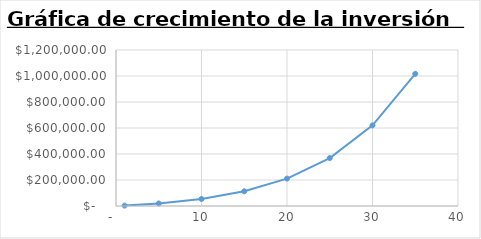
| Category | Monto Acum. |
|---|---|
| 1.0 | 3000 |
| 5.0 | 19489.297 |
| 10.0 | 54179.041 |
| 15.0 | 113212.689 |
| 20.0 | 210749.865 |
| 25.0 | 368606.35 |
| 30.0 | 620255.08 |
| 35.0 | 1016882.318 |